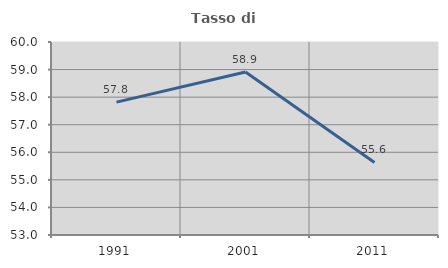
| Category | Tasso di occupazione   |
|---|---|
| 1991.0 | 57.82 |
| 2001.0 | 58.913 |
| 2011.0 | 55.632 |